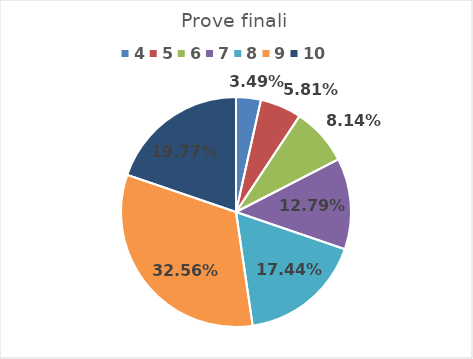
| Category | Series 0 |
|---|---|
| 4.0 | 0.035 |
| 5.0 | 0.058 |
| 6.0 | 0.081 |
| 7.0 | 0.128 |
| 8.0 | 0.174 |
| 9.0 | 0.326 |
| 10.0 | 0.198 |